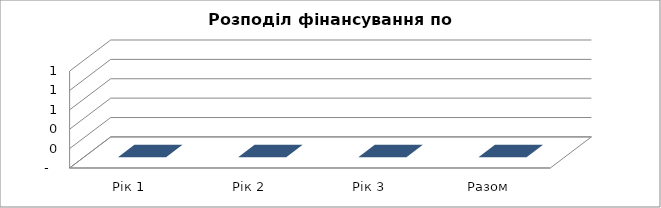
| Category | Разом |
|---|---|
| Рік 1 | 0 |
| Рік 2 | 0 |
| Рік 3 | 0 |
| Разом | 0 |